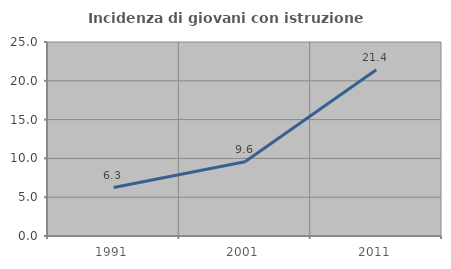
| Category | Incidenza di giovani con istruzione universitaria |
|---|---|
| 1991.0 | 6.25 |
| 2001.0 | 9.574 |
| 2011.0 | 21.429 |